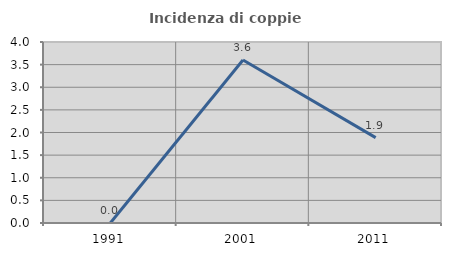
| Category | Incidenza di coppie miste |
|---|---|
| 1991.0 | 0 |
| 2001.0 | 3.604 |
| 2011.0 | 1.887 |